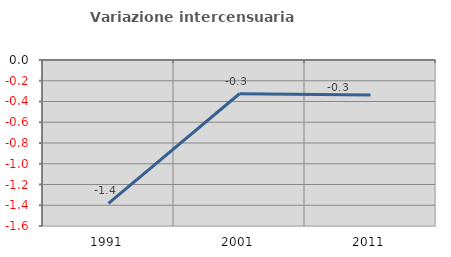
| Category | Variazione intercensuaria annua |
|---|---|
| 1991.0 | -1.382 |
| 2001.0 | -0.325 |
| 2011.0 | -0.336 |